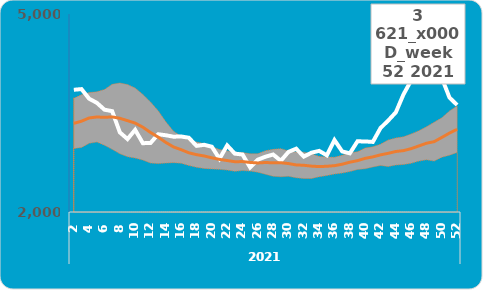
| Category | Som van Overledenen | Som van Verwacht |
|---|---|---|
| 0 | 3852 | 3343 |
| 1 | 3862 | 3376 |
| 2 | 3716 | 3425 |
| 3 | 3654 | 3440 |
| 4 | 3550 | 3434 |
| 5 | 3528 | 3441 |
| 6 | 3207 | 3420 |
| 7 | 3105 | 3384 |
| 8 | 3245 | 3347 |
| 9 | 3043 | 3285 |
| 10 | 3045 | 3205 |
| 11 | 3178 | 3134 |
| 12 | 3163 | 3054 |
| 13 | 3141 | 2986 |
| 14 | 3144 | 2944 |
| 15 | 3125 | 2897 |
| 16 | 3002 | 2869 |
| 17 | 3018 | 2849 |
| 18 | 2989 | 2821 |
| 19 | 2806 | 2797 |
| 20 | 3009 | 2780 |
| 21 | 2884 | 2762 |
| 22 | 2871 | 2764 |
| 23 | 2675 | 2751 |
| 24 | 2793 | 2743 |
| 25 | 2838 | 2750 |
| 26 | 2871 | 2745 |
| 27 | 2776 | 2747 |
| 28 | 2911 | 2734 |
| 29 | 2959 | 2713 |
| 30 | 2839 | 2708 |
| 31 | 2899 | 2695 |
| 32 | 2926 | 2688 |
| 33 | 2859 | 2693 |
| 34 | 3090 | 2702 |
| 35 | 2918 | 2724 |
| 36 | 2889 | 2755 |
| 37 | 3071 | 2778 |
| 38 | 3069 | 2813 |
| 39 | 3062 | 2835 |
| 40 | 3272 | 2866 |
| 41 | 3385 | 2889 |
| 42 | 3510 | 2917 |
| 43 | 3782 | 2930 |
| 44 | 3994 | 2960 |
| 45 | 4187 | 3001 |
| 46 | 4386 | 3042 |
| 47 | 4362 | 3066 |
| 48 | 4030 | 3130 |
| 49 | 3733 | 3196 |
| 50 | 3621 | 3253 |